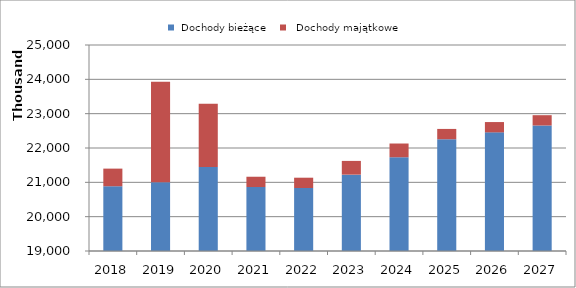
| Category |  Dochody bieżące |   Dochody majątkowe |
|---|---|---|
| 2018.0 | 20886080 | 513374 |
| 2019.0 | 21000748 | 2927822 |
| 2020.0 | 21447811 | 1842182 |
| 2021.0 | 20863045 | 300000 |
| 2022.0 | 20834936 | 300000 |
| 2023.0 | 21223984 | 400000 |
| 2024.0 | 21730704 | 400000 |
| 2025.0 | 22255625 | 300000 |
| 2026.0 | 22455625 | 300000 |
| 2027.0 | 22655625 | 300000 |